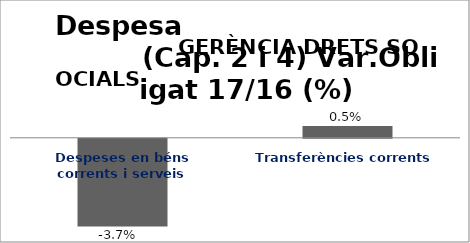
| Category | Series 0 |
|---|---|
| Despeses en béns corrents i serveis | -0.037 |
| Transferències corrents | 0.005 |